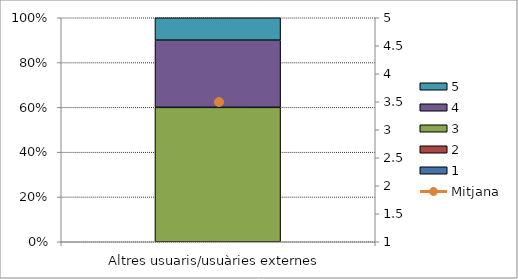
| Category | 1 | 2 | 3 | 4 | 5 |
|---|---|---|---|---|---|
| Altres usuaris/usuàries externes | 0 | 0 | 6 | 3 | 1 |